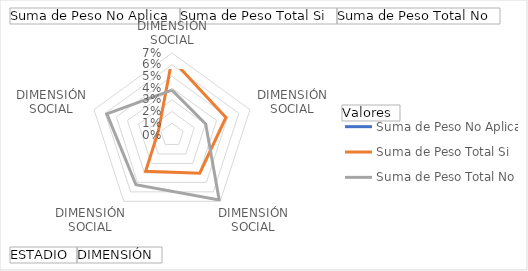
| Category | Suma de Peso No Aplica | Suma de Peso Total Si | Suma de Peso Total No |
|---|---|---|---|
| 0 | 0 | 0.065 | 0.038 |
| 1 | 0 | 0.048 | 0.03 |
| 2 | 0 | 0.04 | 0.069 |
| 3 | 0 | 0.038 | 0.052 |
| 4 | 0 | 0.012 | 0.058 |